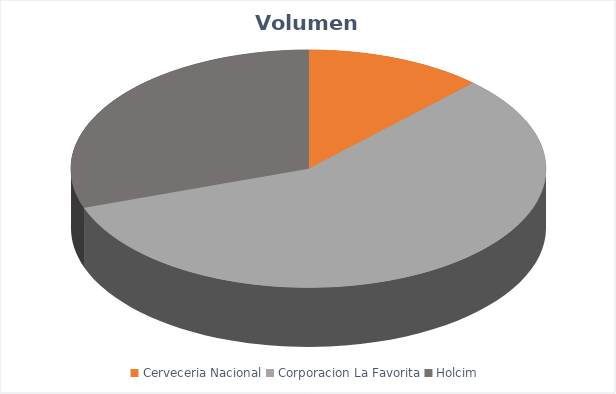
| Category | VOLUMEN ($USD) |
|---|---|
| Cerveceria Nacional | 2970 |
| Corporacion La Favorita | 14057.84 |
| Holcim | 7420 |